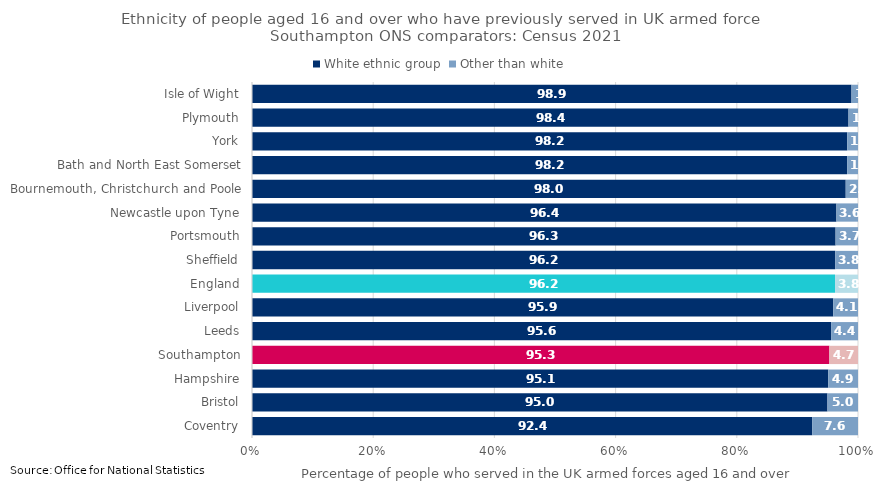
| Category | White ethnic group | Other than white |
|---|---|---|
| Coventry | 92.439 | 7.561 |
| Bristol | 94.964 | 5.036 |
| Hampshire | 95.092 | 4.908 |
| Southampton | 95.28 | 4.72 |
| Leeds | 95.564 | 4.436 |
| Liverpool | 95.915 | 4.085 |
| England | 96.214 | 3.786 |
| Sheffield | 96.25 | 3.75 |
| Portsmouth | 96.303 | 3.697 |
| Newcastle upon Tyne | 96.443 | 3.557 |
| Bournemouth, Christchurch and Poole | 97.974 | 2.026 |
| Bath and North East Somerset | 98.208 | 1.792 |
| York | 98.226 | 1.774 |
| Plymouth | 98.435 | 1.565 |
| Isle of Wight | 98.93 | 1.07 |